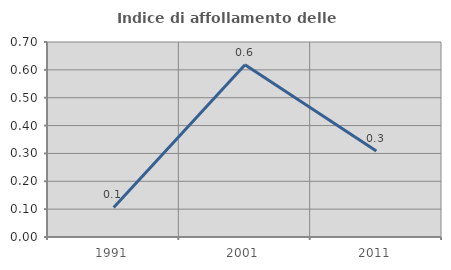
| Category | Indice di affollamento delle abitazioni  |
|---|---|
| 1991.0 | 0.106 |
| 2001.0 | 0.619 |
| 2011.0 | 0.308 |